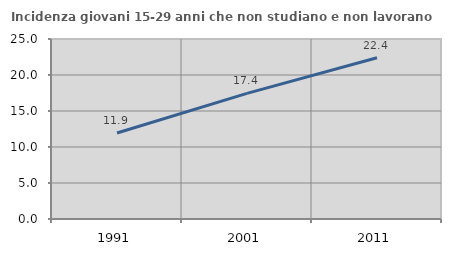
| Category | Incidenza giovani 15-29 anni che non studiano e non lavorano  |
|---|---|
| 1991.0 | 11.944 |
| 2001.0 | 17.442 |
| 2011.0 | 22.405 |